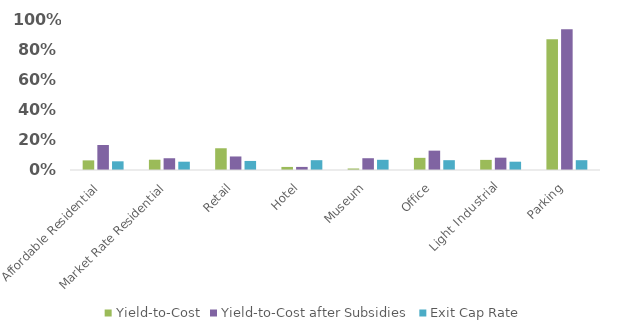
| Category | Yield-to-Cost | Yield-to-Cost after Subsidies | Exit Cap Rate |
|---|---|---|---|
| Affordable Residential | 0.064 | 0.165 | 0.058 |
| Market Rate Residential | 0.068 | 0.078 | 0.055 |
| Retail | 0.144 | 0.09 | 0.06 |
| Hotel | 0.02 | 0.02 | 0.065 |
| Museum | 0.01 | 0.078 | 0.068 |
| Office | 0.081 | 0.128 | 0.065 |
| Light Industrial | 0.067 | 0.082 | 0.055 |
| Parking | 0.866 | 0.932 | 0.065 |